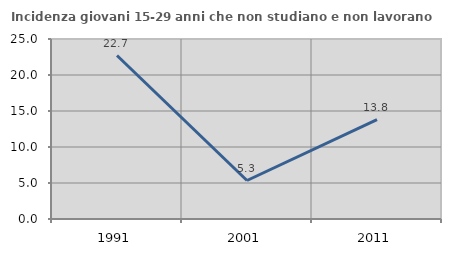
| Category | Incidenza giovani 15-29 anni che non studiano e non lavorano  |
|---|---|
| 1991.0 | 22.703 |
| 2001.0 | 5.346 |
| 2011.0 | 13.816 |